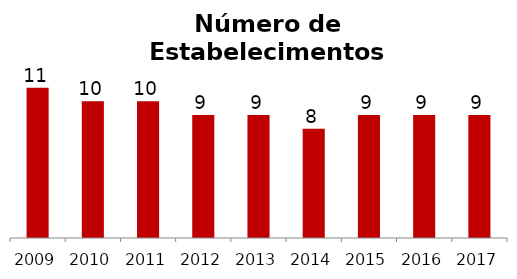
| Category | Cultura e Lazer |
|---|---|
| 2009.0 | 11 |
| 2010.0 | 10 |
| 2011.0 | 10 |
| 2012.0 | 9 |
| 2013.0 | 9 |
| 2014.0 | 8 |
| 2015.0 | 9 |
| 2016.0 | 9 |
| 2017.0 | 9 |